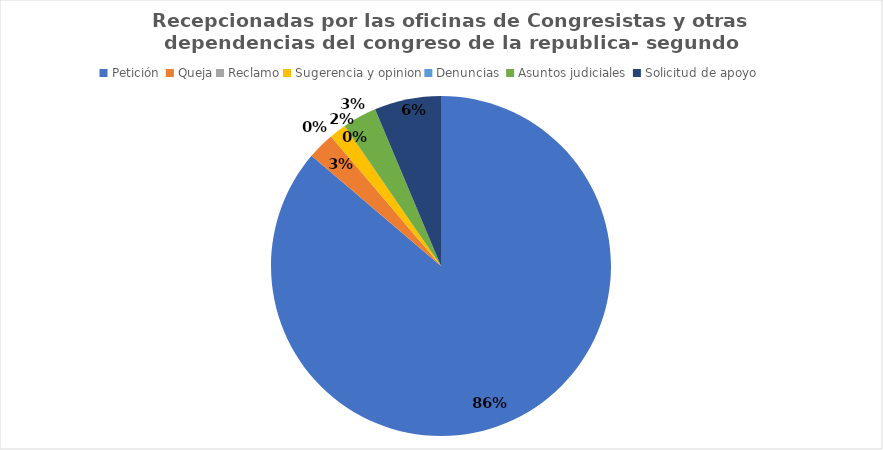
| Category | Series 0 |
|---|---|
| Petición  | 1170 |
| Queja | 35 |
| Reclamo | 0 |
| Sugerencia y opinion | 22 |
| Denuncias  | 0 |
| Asuntos judiciales  | 44 |
| Solicitud de apoyo | 86 |